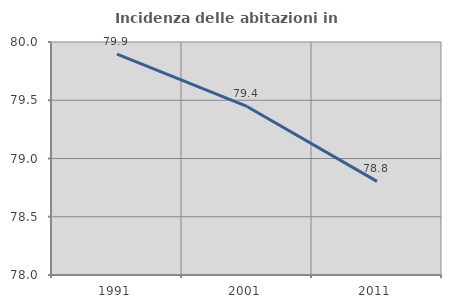
| Category | Incidenza delle abitazioni in proprietà  |
|---|---|
| 1991.0 | 79.895 |
| 2001.0 | 79.447 |
| 2011.0 | 78.803 |